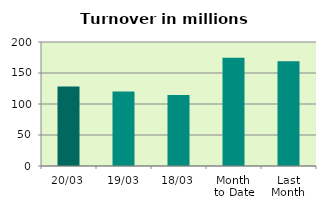
| Category | Series 0 |
|---|---|
| 20/03 | 128.071 |
| 19/03 | 120.063 |
| 18/03 | 114.492 |
| Month 
to Date | 174.507 |
| Last
Month | 168.971 |